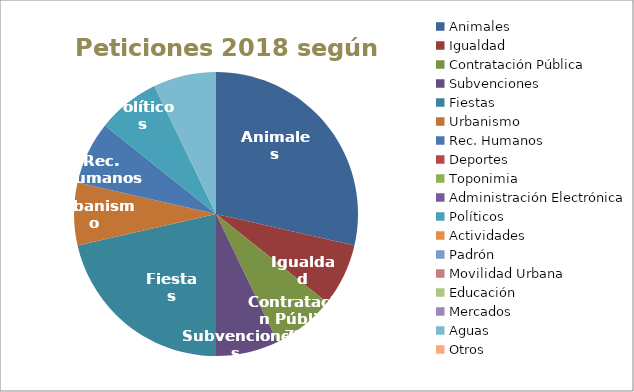
| Category | Series 0 |
|---|---|
| Animales | 0.286 |
| Igualdad | 0.071 |
| Contratación Pública | 0.071 |
| Subvenciones | 0.071 |
| Fiestas | 0.214 |
| Urbanismo | 0.071 |
| Rec. Humanos | 0.071 |
| Deportes | 0 |
| Toponimia | 0 |
| Administración Electrónica | 0 |
| Políticos | 0.071 |
| Actividades | 0 |
| Padrón  | 0 |
| Movilidad Urbana | 0 |
| Educación | 0 |
| Mercados | 0 |
| Aguas | 0.071 |
| Otros | 0 |